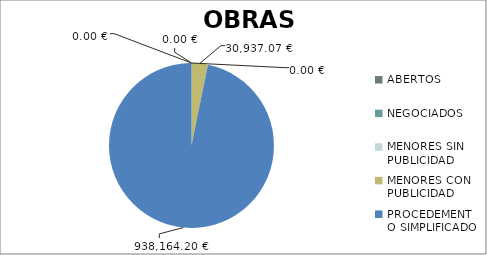
| Category | Series 0 |
|---|---|
| ABERTOS  | 0 |
| NEGOCIADOS  | 0 |
| MENORES SIN PUBLICIDAD | 0 |
| MENORES CON PUBLICIDAD | 30937.07 |
| PROCEDEMENTO SIMPLIFICADO | 938164.2 |